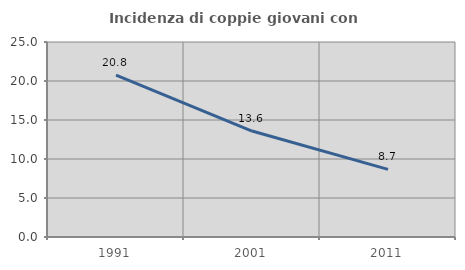
| Category | Incidenza di coppie giovani con figli |
|---|---|
| 1991.0 | 20.753 |
| 2001.0 | 13.585 |
| 2011.0 | 8.671 |